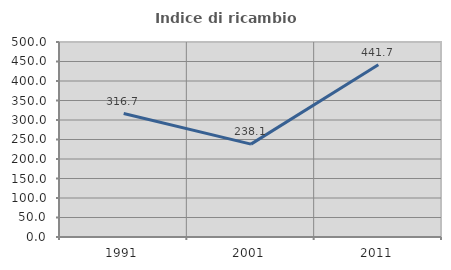
| Category | Indice di ricambio occupazionale  |
|---|---|
| 1991.0 | 316.667 |
| 2001.0 | 238.095 |
| 2011.0 | 441.667 |